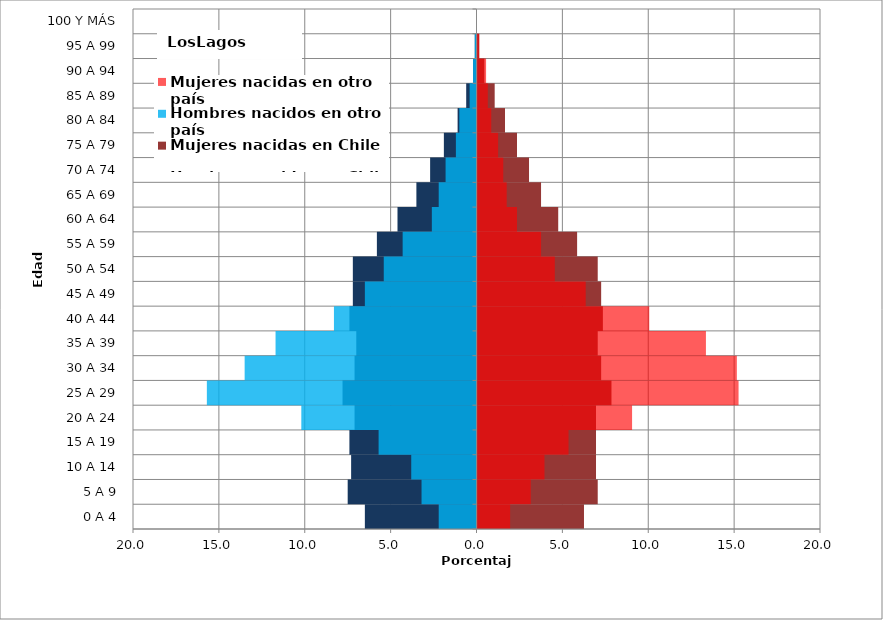
| Category | Hombres nacidos en Chile | Mujeres nacidas en Chile | Hombres nacidos en otro país | Mujeres nacidas en otro país |
|---|---|---|---|---|
| 0 A 4 | -6.5 | 6.2 | -2.2 | 1.9 |
| 5 A 9 | -7.5 | 7 | -3.2 | 3.1 |
| 10 A 14 | -7.3 | 6.9 | -3.8 | 3.9 |
| 15 A 19 | -7.4 | 6.9 | -5.7 | 5.3 |
| 20 A 24 | -7.1 | 6.9 | -10.2 | 9 |
| 25 A 29 | -7.8 | 7.8 | -15.7 | 15.2 |
| 30 A 34 | -7.1 | 7.2 | -13.5 | 15.1 |
| 35 A 39 | -7 | 7 | -11.7 | 13.3 |
| 40 A 44 | -7.4 | 7.3 | -8.3 | 10 |
| 45 A 49 | -7.2 | 7.2 | -6.5 | 6.3 |
| 50 A 54 | -7.2 | 7 | -5.4 | 4.5 |
| 55 A 59 | -5.8 | 5.8 | -4.3 | 3.7 |
| 60 A 64 | -4.6 | 4.7 | -2.6 | 2.3 |
| 65 A 69 | -3.5 | 3.7 | -2.2 | 1.7 |
| 70 A 74 | -2.7 | 3 | -1.8 | 1.5 |
| 75 A 79 | -1.9 | 2.3 | -1.2 | 1.2 |
| 80 A 84 | -1.1 | 1.6 | -1 | 0.8 |
| 85 A 89 | -0.6 | 1 | -0.4 | 0.6 |
| 90 A 94 | -0.2 | 0.4 | -0.2 | 0.5 |
| 95 A 99 | -0.1 | 0.1 | -0.1 | 0.1 |
| 100 Y MÁS | 0 | 0 | 0 | 0 |